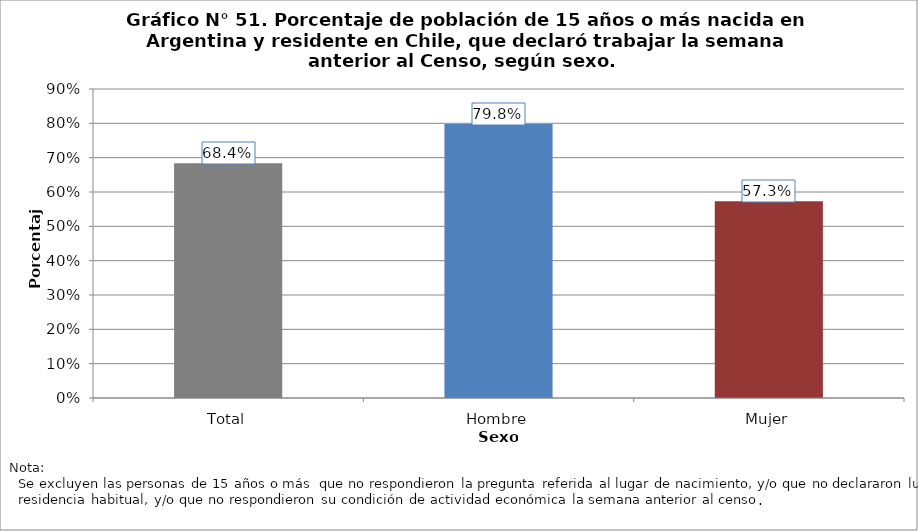
| Category | Población que declara trabajar  |
|---|---|
| Total | 0.684 |
| Hombre | 0.798 |
| Mujer | 0.573 |